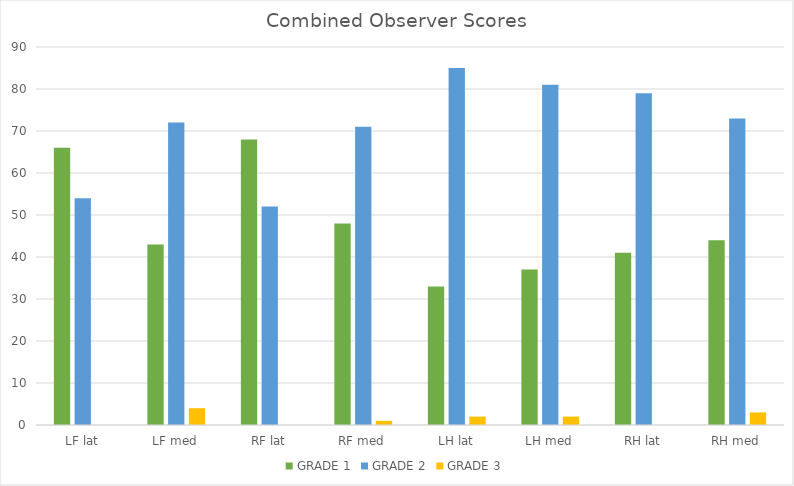
| Category | GRADE 1 | GRADE 2 | GRADE 3 |
|---|---|---|---|
| LF lat | 66 | 54 | 0 |
| LF med | 43 | 72 | 4 |
| RF lat | 68 | 52 | 0 |
| RF med | 48 | 71 | 1 |
| LH lat | 33 | 85 | 2 |
| LH med | 37 | 81 | 2 |
| RH lat | 41 | 79 | 0 |
| RH med | 44 | 73 | 3 |